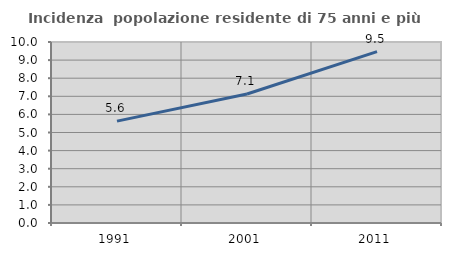
| Category | Incidenza  popolazione residente di 75 anni e più |
|---|---|
| 1991.0 | 5.629 |
| 2001.0 | 7.125 |
| 2011.0 | 9.469 |